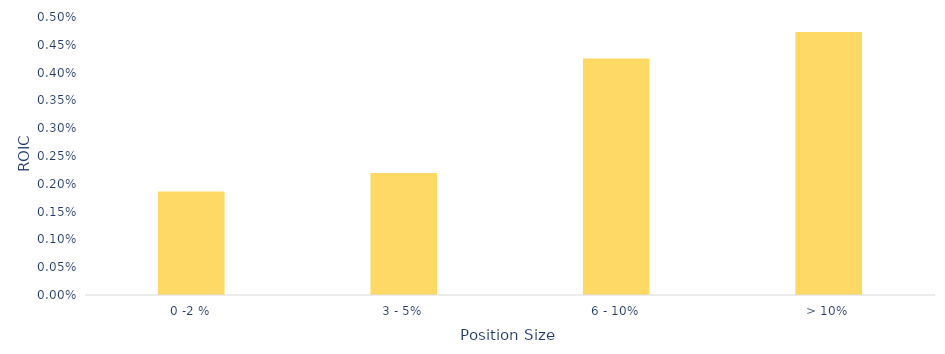
| Category | Series 0 |
|---|---|
| 0 -2 % | 0.002 |
| 3 - 5% | 0.002 |
| 6 - 10% | 0.004 |
| > 10% | 0.005 |